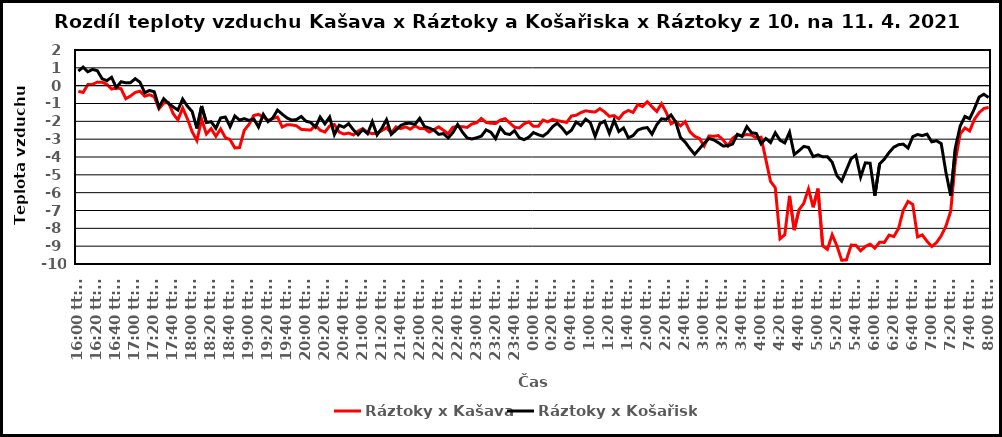
| Category | Ráztoky x Kašava | Ráztoky x Košařiska |
|---|---|---|
| 0.6666666666666666 | -0.32 | 0.82 |
| 0.6701388888888888 | -0.38 | 1.04 |
| 0.673611111111111 | 0.06 | 0.78 |
| 0.677083333333333 | 0.07 | 0.91 |
| 0.680555555555555 | 0.2 | 0.84 |
| 0.684027777777778 | 0.19 | 0.39 |
| 0.6875 | 0.08 | 0.28 |
| 0.690972222222222 | -0.19 | 0.47 |
| 0.694444444444444 | -0.13 | -0.11 |
| 0.697916666666667 | -0.17 | 0.22 |
| 0.701388888888889 | -0.73 | 0.16 |
| 0.704861111111111 | -0.58 | 0.17 |
| 0.708333333333333 | -0.38 | 0.39 |
| 0.711805555555555 | -0.31 | 0.19 |
| 0.715277777777778 | -0.59 | -0.4 |
| 0.71875 | -0.51 | -0.27 |
| 0.722222222222222 | -0.62 | -0.34 |
| 0.725694444444444 | -1.3 | -1.21 |
| 0.729166666666666 | -0.97 | -0.73 |
| 0.732638888888889 | -0.95 | -0.99 |
| 0.736111111111111 | -1.57 | -1.19 |
| 0.739583333333333 | -1.92 | -1.37 |
| 0.743055555555555 | -1.25 | -0.75 |
| 0.746527777777777 | -1.86 | -1.15 |
| 0.75 | -2.58 | -1.45 |
| 0.753472222222222 | -3.08 | -2.4 |
| 0.756944444444444 | -1.89 | -1.14 |
| 0.760416666666666 | -2.71 | -2.07 |
| 0.763888888888889 | -2.41 | -2.02 |
| 0.767361111111111 | -2.84 | -2.39 |
| 0.770833333333333 | -2.43 | -1.81 |
| 0.774305555555556 | -2.91 | -1.76 |
| 0.777777777777778 | -3.03 | -2.3 |
| 0.78125 | -3.49 | -1.7 |
| 0.784722222222222 | -3.47 | -1.93 |
| 0.788194444444444 | -2.5 | -1.85 |
| 0.791666666666667 | -2.17 | -1.95 |
| 0.795138888888889 | -1.67 | -1.87 |
| 0.798611111111111 | -1.61 | -2.32 |
| 0.802083333333333 | -1.75 | -1.61 |
| 0.805555555555555 | -1.95 | -2.02 |
| 0.809027777777778 | -1.85 | -1.81 |
| 0.8125 | -1.76 | -1.37 |
| 0.815972222222222 | -2.32 | -1.6 |
| 0.819444444444444 | -2.19 | -1.81 |
| 0.822916666666666 | -2.2 | -1.93 |
| 0.826388888888889 | -2.25 | -1.9 |
| 0.829861111111111 | -2.45 | -1.73 |
| 0.833333333333333 | -2.47 | -1.99 |
| 0.836805555555555 | -2.49 | -2.06 |
| 0.840277777777777 | -2.23 | -2.33 |
| 0.84375 | -2.5 | -1.76 |
| 0.847222222222222 | -2.6 | -2.14 |
| 0.850694444444444 | -2.26 | -1.76 |
| 0.854166666666666 | -2.18 | -2.75 |
| 0.857638888888889 | -2.6 | -2.22 |
| 0.861111111111111 | -2.71 | -2.33 |
| 0.864583333333333 | -2.66 | -2.13 |
| 0.868055555555555 | -2.76 | -2.47 |
| 0.871527777777777 | -2.54 | -2.75 |
| 0.875 | -2.41 | -2.46 |
| 0.878472222222222 | -2.62 | -2.69 |
| 0.881944444444444 | -2.69 | -2.02 |
| 0.885416666666666 | -2.67 | -2.76 |
| 0.888888888888888 | -2.52 | -2.39 |
| 0.892361111111111 | -2.36 | -1.91 |
| 0.895833333333333 | -2.65 | -2.73 |
| 0.899305555555555 | -2.31 | -2.49 |
| 0.902777777777777 | -2.41 | -2.23 |
| 0.906249999999999 | -2.31 | -2.12 |
| 0.909722222222222 | -2.44 | -2.11 |
| 0.913194444444444 | -2.25 | -2.17 |
| 0.916666666666666 | -2.4 | -1.83 |
| 0.920138888888888 | -2.4 | -2.29 |
| 0.923611111111111 | -2.6 | -2.38 |
| 0.927083333333333 | -2.47 | -2.49 |
| 0.930555555555555 | -2.31 | -2.73 |
| 0.934027777777777 | -2.5 | -2.69 |
| 0.937499999999999 | -2.69 | -2.93 |
| 0.940972222222222 | -2.33 | -2.63 |
| 0.944444444444444 | -2.29 | -2.18 |
| 0.947916666666666 | -2.3 | -2.6 |
| 0.951388888888888 | -2.34 | -2.93 |
| 0.95486111111111 | -2.15 | -2.99 |
| 0.958333333333333 | -2.08 | -2.92 |
| 0.961805555555555 | -1.84 | -2.83 |
| 0.965277777777777 | -2.06 | -2.48 |
| 0.968749999999999 | -2.11 | -2.61 |
| 0.972222222222221 | -2.12 | -2.97 |
| 0.975694444444444 | -1.93 | -2.35 |
| 0.979166666666666 | -1.85 | -2.68 |
| 0.982638888888888 | -2.09 | -2.74 |
| 0.98611111111111 | -2.33 | -2.52 |
| 0.989583333333333 | -2.37 | -2.92 |
| 0.993055555555555 | -2.14 | -3.03 |
| 0.996527777777777 | -2.03 | -2.89 |
| 0.999999999999999 | -2.28 | -2.63 |
| 1900-01-01 00:05:00 | -2.28 | -2.75 |
| 1900-01-01 00:10:00 | -1.93 | -2.83 |
| 1900-01-01 00:15:00 | -2.03 | -2.63 |
| 1900-01-01 00:20:00 | -1.89 | -2.31 |
| 1900-01-01 00:25:00 | -1.96 | -2.1 |
| 1900-01-01 00:30:00 | -2.01 | -2.37 |
| 1900-01-01 00:35:00 | -2.06 | -2.7 |
| 1900-01-01 00:40:00 | -1.7 | -2.5 |
| 1900-01-01 00:45:00 | -1.66 | -2.04 |
| 1900-01-01 00:50:00 | -1.51 | -2.23 |
| 1900-01-01 00:55:00 | -1.41 | -1.88 |
| 1900-01-01 01:00:00 | -1.45 | -2.08 |
| 1900-01-01 01:05:00 | -1.48 | -2.84 |
| 1900-01-01 01:10:00 | -1.29 | -2.13 |
| 1900-01-01 01:15:00 | -1.47 | -1.99 |
| 1900-01-01 01:20:00 | -1.72 | -2.67 |
| 1900-01-01 01:25:00 | -1.68 | -1.94 |
| 1900-01-01 01:30:00 | -1.86 | -2.57 |
| 1900-01-01 01:35:00 | -1.53 | -2.37 |
| 1900-01-01 01:40:00 | -1.39 | -2.92 |
| 1900-01-01 01:45:00 | -1.5 | -2.8 |
| 1900-01-01 01:50:00 | -1.06 | -2.49 |
| 1900-01-01 01:55:00 | -1.17 | -2.39 |
| 1900-01-01 02:00:00 | -0.9 | -2.35 |
| 1900-01-01 02:05:00 | -1.18 | -2.72 |
| 1900-01-01 02:10:00 | -1.45 | -2.19 |
| 1900-01-01 02:15:00 | -1.01 | -1.86 |
| 1900-01-01 02:20:00 | -1.5 | -1.89 |
| 1900-01-01 02:25:00 | -2.14 | -1.64 |
| 1900-01-01 02:30:00 | -2 | -2.04 |
| 1900-01-01 02:35:00 | -2.25 | -2.9 |
| 1900-01-01 02:40:00 | -2.02 | -3.17 |
| 1900-01-01 02:45:00 | -2.59 | -3.53 |
| 1900-01-01 02:50:00 | -2.84 | -3.85 |
| 1900-01-01 02:55:00 | -2.96 | -3.54 |
| 1900-01-01 03:00:00 | -3.38 | -3.23 |
| 1900-01-01 03:05:00 | -2.82 | -2.96 |
| 1900-01-01 03:10:00 | -2.84 | -3.04 |
| 1900-01-01 03:15:00 | -2.8 | -3.2 |
| 1900-01-01 03:20:00 | -3.05 | -3.38 |
| 1900-01-01 03:25:00 | -3.38 | -3.37 |
| 1900-01-01 03:30:00 | -2.95 | -3.27 |
| 1900-01-01 03:35:00 | -2.76 | -2.73 |
| 1900-01-01 03:40:00 | -2.8 | -2.85 |
| 1900-01-01 03:45:00 | -2.74 | -2.3 |
| 1900-01-01 03:50:00 | -2.77 | -2.64 |
| 1900-01-01 03:55:00 | -2.93 | -2.68 |
| 1900-01-01 04:00:00 | -2.89 | -3.26 |
| 1900-01-01 04:05:00 | -4.13 | -2.96 |
| 1900-01-01 04:10:00 | -5.37 | -3.19 |
| 1900-01-01 04:15:00 | -5.72 | -2.64 |
| 1900-01-01 04:20:00 | -8.59 | -3.06 |
| 1900-01-01 04:25:00 | -8.36 | -3.21 |
| 1900-01-01 04:30:00 | -6.18 | -2.61 |
| 1900-01-01 04:35:00 | -8.1 | -3.86 |
| 1900-01-01 04:40:00 | -6.96 | -3.65 |
| 1900-01-01 04:45:00 | -6.6 | -3.41 |
| 1900-01-01 04:50:00 | -5.79 | -3.46 |
| 1900-01-01 04:55:00 | -6.82 | -3.98 |
| 1900-01-01 05:00:00 | -5.78 | -3.88 |
| 1900-01-01 05:05:00 | -8.98 | -3.99 |
| 1900-01-01 05:10:00 | -9.18 | -3.99 |
| 1900-01-01 05:15:00 | -8.36 | -4.29 |
| 1900-01-01 05:20:00 | -8.98 | -5.05 |
| 1900-01-01 05:25:00 | -9.79 | -5.35 |
| 1900-01-01 05:30:00 | -9.77 | -4.72 |
| 1900-01-01 05:35:00 | -8.94 | -4.09 |
| 1900-01-01 05:40:00 | -8.95 | -3.9 |
| 1900-01-01 05:45:00 | -9.26 | -5.12 |
| 1900-01-01 05:50:00 | -9.02 | -4.33 |
| 1900-01-01 05:55:00 | -8.89 | -4.35 |
| 1900-01-01 06:00:00 | -9.11 | -6.17 |
| 1900-01-01 06:05:00 | -8.78 | -4.39 |
| 1900-01-01 06:10:00 | -8.79 | -4.12 |
| 1900-01-01 06:15:00 | -8.38 | -3.75 |
| 1900-01-01 06:20:00 | -8.46 | -3.45 |
| 1900-01-01 06:25:00 | -8.01 | -3.31 |
| 1900-01-01 06:30:00 | -6.98 | -3.28 |
| 1900-01-01 06:35:00 | -6.49 | -3.5 |
| 1900-01-01 06:40:00 | -6.66 | -2.86 |
| 1900-01-01 06:45:00 | -8.48 | -2.74 |
| 1900-01-01 06:50:00 | -8.37 | -2.8 |
| 1900-01-01 06:55:00 | -8.72 | -2.72 |
| 1900-01-01 07:00:00 | -9.02 | -3.15 |
| 1900-01-01 07:05:00 | -8.8 | -3.09 |
| 1900-01-01 07:10:00 | -8.42 | -3.25 |
| 1900-01-01 07:15:00 | -7.87 | -4.87 |
| 1900-01-01 07:20:00 | -7.04 | -6.17 |
| 1900-01-01 07:25:00 | -4.18 | -3.47 |
| 1900-01-01 07:30:00 | -2.71 | -2.26 |
| 1900-01-01 07:35:00 | -2.37 | -1.73 |
| 1900-01-01 07:40:00 | -2.54 | -1.85 |
| 1900-01-01 07:45:00 | -1.89 | -1.29 |
| 1900-01-01 07:50:00 | -1.51 | -0.64 |
| 1900-01-01 07:55:00 | -1.28 | -0.48 |
| 1900-01-01 08:00:00 | -1.22 | -0.66 |